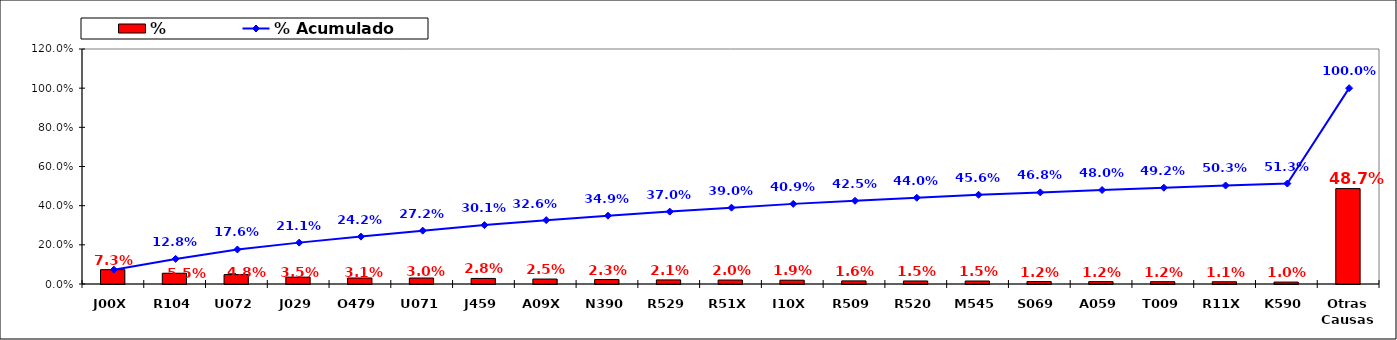
| Category | % |
|---|---|
| J00X | 0.073 |
| R104 | 0.055 |
| U072 | 0.048 |
| J029 | 0.035 |
| O479 | 0.031 |
| U071 | 0.03 |
| J459 | 0.028 |
| A09X | 0.025 |
| N390 | 0.023 |
| R529 | 0.021 |
| R51X | 0.02 |
| I10X | 0.019 |
| R509 | 0.016 |
| R520 | 0.015 |
| M545 | 0.015 |
| S069 | 0.012 |
| A059 | 0.012 |
| T009 | 0.012 |
| R11X | 0.011 |
| K590 | 0.01 |
| Otras Causas | 0.487 |